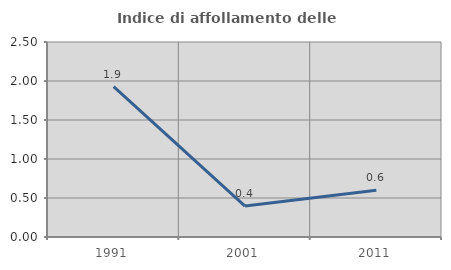
| Category | Indice di affollamento delle abitazioni  |
|---|---|
| 1991.0 | 1.929 |
| 2001.0 | 0.397 |
| 2011.0 | 0.598 |